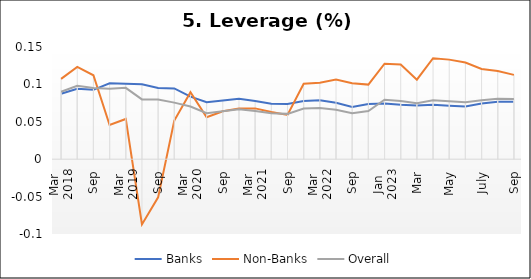
| Category | Banks | Non-Banks | Overall |
|---|---|---|---|
| 0 | 0.088 | 0.107 | 0.09 |
| 1 | 0.094 | 0.123 | 0.098 |
| 2 | 0.093 | 0.112 | 0.095 |
| 3 | 0.102 | 0.046 | 0.094 |
| 4 | 0.101 | 0.054 | 0.095 |
| 5 | 0.1 | -0.087 | 0.08 |
| 6 | 0.095 | -0.051 | 0.08 |
| 7 | 0.095 | 0.052 | 0.076 |
| 8 | 0.084 | 0.09 | 0.07 |
| 9 | 0.076 | 0.056 | 0.062 |
| 10 | 0.079 | 0.064 | 0.064 |
| 11 | 0.081 | 0.068 | 0.067 |
| 12 | 0.078 | 0.068 | 0.064 |
| 13 | 0.074 | 0.063 | 0.061 |
| 14 | 0.074 | 0.059 | 0.061 |
| 15 | 0.078 | 0.101 | 0.068 |
| 16 | 0.079 | 0.102 | 0.068 |
| 17 | 0.075 | 0.106 | 0.066 |
| 18 | 0.07 | 0.102 | 0.061 |
| 19 | 0.074 | 0.1 | 0.064 |
| 20 | 0.074 | 0.128 | 0.079 |
| 21 | 0.073 | 0.126 | 0.078 |
| 22 | 0.072 | 0.106 | 0.075 |
| 23 | 0.073 | 0.135 | 0.079 |
| 24 | 0.072 | 0.133 | 0.077 |
| 25 | 0.071 | 0.129 | 0.076 |
| 26 | 0.074 | 0.121 | 0.079 |
| 27 | 0.077 | 0.118 | 0.081 |
| 28 | 0.077 | 0.113 | 0.08 |